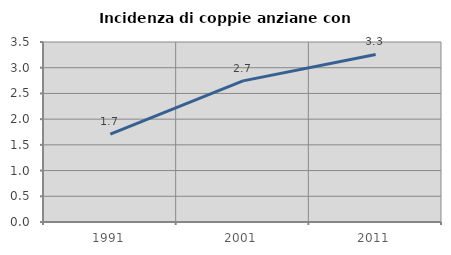
| Category | Incidenza di coppie anziane con figli |
|---|---|
| 1991.0 | 1.71 |
| 2001.0 | 2.744 |
| 2011.0 | 3.258 |